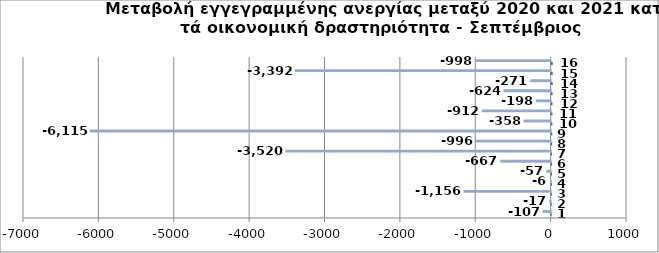
| Category | Series 0 | Series 1 |
|---|---|---|
| 0 | 1 | -107 |
| 1 | 2 | -17 |
| 2 | 3 | -1156 |
| 3 | 4 | -6 |
| 4 | 5 | -57 |
| 5 | 6 | -667 |
| 6 | 7 | -3520 |
| 7 | 8 | -996 |
| 8 | 9 | -6115 |
| 9 | 10 | -358 |
| 10 | 11 | -912 |
| 11 | 12 | -198 |
| 12 | 13 | -624 |
| 13 | 14 | -271 |
| 14 | 15 | -3392 |
| 15 | 16 | -998 |